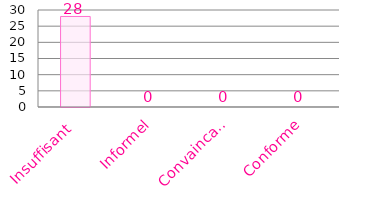
| Category | Histo Conformité |
|---|---|
| Insuffisant | 28 |
| Informel | 0 |
| Convaincant | 0 |
| Conforme | 0 |